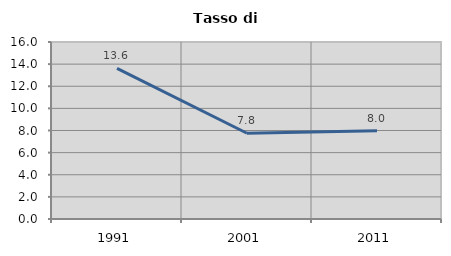
| Category | Tasso di disoccupazione   |
|---|---|
| 1991.0 | 13.621 |
| 2001.0 | 7.752 |
| 2011.0 | 7.983 |